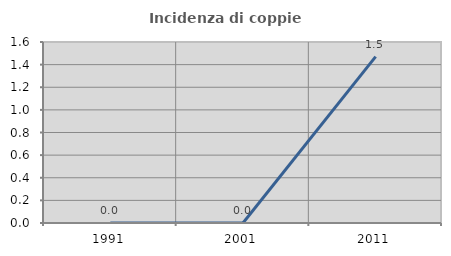
| Category | Incidenza di coppie miste |
|---|---|
| 1991.0 | 0 |
| 2001.0 | 0 |
| 2011.0 | 1.471 |